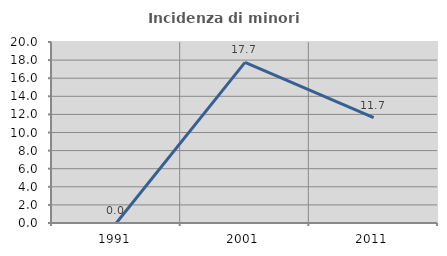
| Category | Incidenza di minori stranieri |
|---|---|
| 1991.0 | 0 |
| 2001.0 | 17.742 |
| 2011.0 | 11.65 |